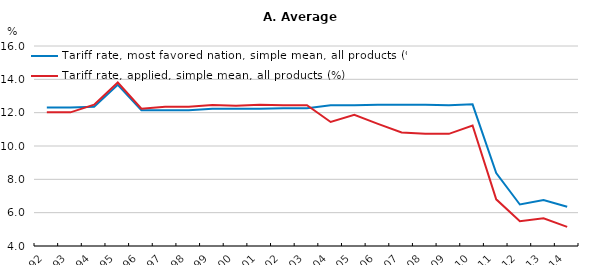
| Category | Tariff rate, most favored nation, simple mean, all products (%) | Tariff rate, applied, simple mean, all products (%) |
|---|---|---|
| 1992.0 | 12.31 | 12.02 |
| 1993.0 | 12.31 | 12.02 |
| 1994.0 | 12.36 | 12.48 |
| 1995.0 | 13.67 | 13.81 |
| 1996.0 | 12.14 | 12.24 |
| 1997.0 | 12.14 | 12.36 |
| 1998.0 | 12.14 | 12.36 |
| 1999.0 | 12.23 | 12.46 |
| 2000.0 | 12.23 | 12.42 |
| 2001.0 | 12.23 | 12.47 |
| 2002.0 | 12.27 | 12.45 |
| 2003.0 | 12.27 | 12.45 |
| 2004.0 | 12.45 | 11.44 |
| 2005.0 | 12.45 | 11.87 |
| 2006.0 | 12.48 | 11.33 |
| 2007.0 | 12.48 | 10.81 |
| 2008.0 | 12.48 | 10.74 |
| 2009.0 | 12.45 | 10.73 |
| 2010.0 | 12.5 | 11.23 |
| 2011.0 | 8.38 | 6.8 |
| 2012.0 | 6.49 | 5.49 |
| 2013.0 | 6.76 | 5.66 |
| 2014.0 | 6.35 | 5.15 |